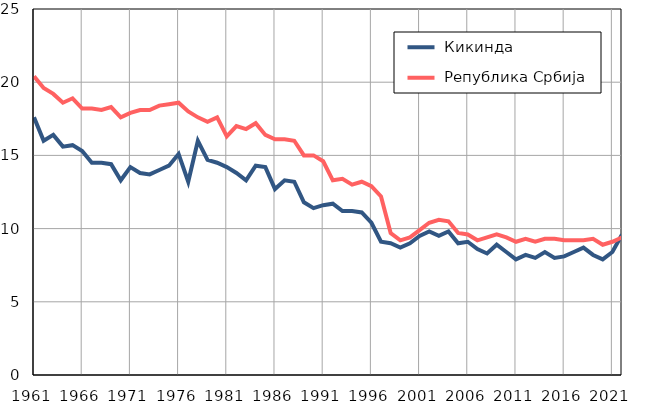
| Category |  Кикинда |  Република Србија |
|---|---|---|
| 1961.0 | 17.6 | 20.4 |
| 1962.0 | 16 | 19.6 |
| 1963.0 | 16.4 | 19.2 |
| 1964.0 | 15.6 | 18.6 |
| 1965.0 | 15.7 | 18.9 |
| 1966.0 | 15.3 | 18.2 |
| 1967.0 | 14.5 | 18.2 |
| 1968.0 | 14.5 | 18.1 |
| 1969.0 | 14.4 | 18.3 |
| 1970.0 | 13.3 | 17.6 |
| 1971.0 | 14.2 | 17.9 |
| 1972.0 | 13.8 | 18.1 |
| 1973.0 | 13.7 | 18.1 |
| 1974.0 | 14 | 18.4 |
| 1975.0 | 14.3 | 18.5 |
| 1976.0 | 15.1 | 18.6 |
| 1977.0 | 13.2 | 18 |
| 1978.0 | 16 | 17.6 |
| 1979.0 | 14.7 | 17.3 |
| 1980.0 | 14.5 | 17.6 |
| 1981.0 | 14.2 | 16.3 |
| 1982.0 | 13.8 | 17 |
| 1983.0 | 13.3 | 16.8 |
| 1984.0 | 14.3 | 17.2 |
| 1985.0 | 14.2 | 16.4 |
| 1986.0 | 12.7 | 16.1 |
| 1987.0 | 13.3 | 16.1 |
| 1988.0 | 13.2 | 16 |
| 1989.0 | 11.8 | 15 |
| 1990.0 | 11.4 | 15 |
| 1991.0 | 11.6 | 14.6 |
| 1992.0 | 11.7 | 13.3 |
| 1993.0 | 11.2 | 13.4 |
| 1994.0 | 11.2 | 13 |
| 1995.0 | 11.1 | 13.2 |
| 1996.0 | 10.4 | 12.9 |
| 1997.0 | 9.1 | 12.2 |
| 1998.0 | 9 | 9.7 |
| 1999.0 | 8.7 | 9.2 |
| 2000.0 | 9 | 9.4 |
| 2001.0 | 9.5 | 9.9 |
| 2002.0 | 9.8 | 10.4 |
| 2003.0 | 9.5 | 10.6 |
| 2004.0 | 9.8 | 10.5 |
| 2005.0 | 9 | 9.7 |
| 2006.0 | 9.1 | 9.6 |
| 2007.0 | 8.6 | 9.2 |
| 2008.0 | 8.3 | 9.4 |
| 2009.0 | 8.9 | 9.6 |
| 2010.0 | 8.4 | 9.4 |
| 2011.0 | 7.9 | 9.1 |
| 2012.0 | 8.2 | 9.3 |
| 2013.0 | 8 | 9.1 |
| 2014.0 | 8.4 | 9.3 |
| 2015.0 | 8 | 9.3 |
| 2016.0 | 8.1 | 9.2 |
| 2017.0 | 8.4 | 9.2 |
| 2018.0 | 8.7 | 9.2 |
| 2019.0 | 8.2 | 9.3 |
| 2020.0 | 7.9 | 8.9 |
| 2021.0 | 8.4 | 9.1 |
| 2022.0 | 9.6 | 9.4 |